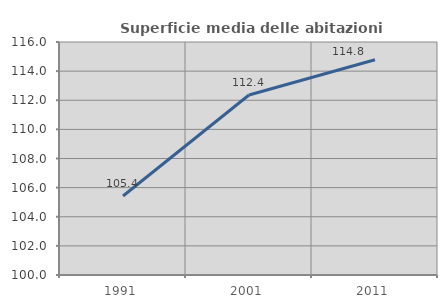
| Category | Superficie media delle abitazioni occupate |
|---|---|
| 1991.0 | 105.425 |
| 2001.0 | 112.361 |
| 2011.0 | 114.778 |